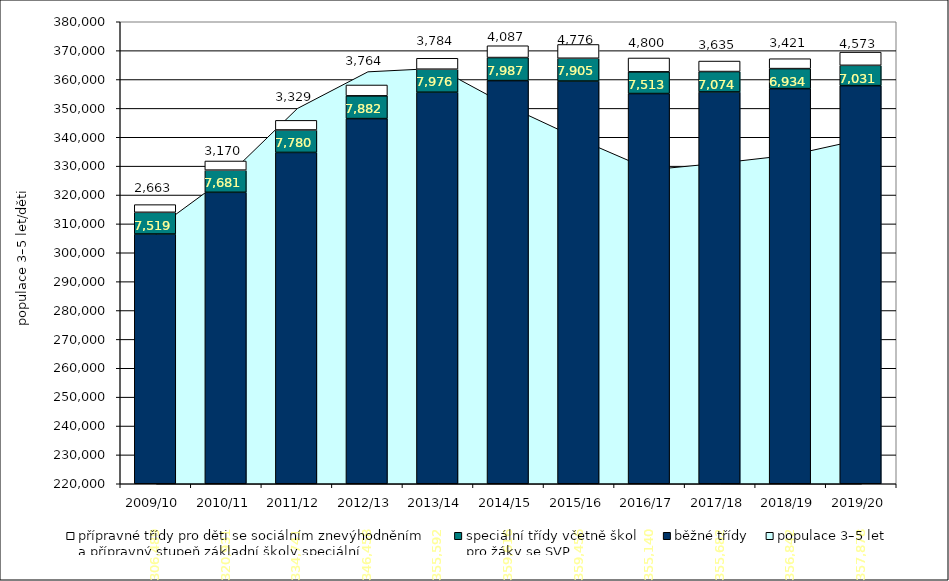
| Category | běžné třídy | speciální třídy včetně škol
pro žáky se SVP | přípravné třídy pro děti se sociálním znevýhodněním
a přípravný stupeň základní školy speciální |
|---|---|---|---|
| 2009/10 | 306489 | 7519 | 2663 |
| 2010/11 | 320931 | 7681 | 3170 |
| 2011/12 | 334741 | 7780 | 3329 |
| 2012/13 | 346458 | 7882 | 3764 |
| 2013/14 | 355592 | 7976 | 3784 |
| 2014/15 | 359616 | 7987 | 4087 |
| 2015/16 | 359456 | 7905 | 4776 |
| 2016/17 | 355140 | 7513 | 4800 |
| 2017/18 | 355682 | 7074 | 3635 |
| 2018/19 | 356842 | 6934 | 3421 |
| 2019/20 | 357878 | 7031 | 4573 |